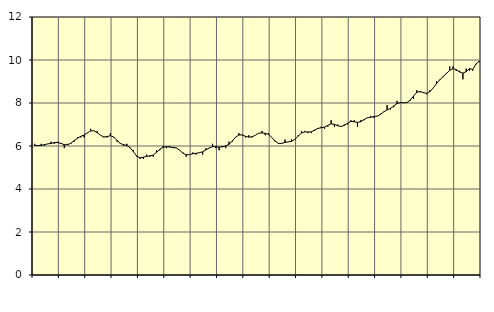
| Category | Piggar | Offentlig förvaltning m.m., SNI 84, 99 |
|---|---|---|
| nan | 6.1 | 6.03 |
| 87.0 | 6 | 6.02 |
| 87.0 | 6.1 | 6.03 |
| 87.0 | 6 | 6.06 |
| nan | 6.1 | 6.1 |
| 88.0 | 6.2 | 6.12 |
| 88.0 | 6.1 | 6.16 |
| 88.0 | 6.2 | 6.16 |
| nan | 6.1 | 6.12 |
| 89.0 | 5.9 | 6.06 |
| 89.0 | 6.1 | 6.06 |
| 89.0 | 6.1 | 6.13 |
| nan | 6.2 | 6.25 |
| 90.0 | 6.4 | 6.36 |
| 90.0 | 6.4 | 6.45 |
| 90.0 | 6.4 | 6.51 |
| nan | 6.6 | 6.61 |
| 91.0 | 6.8 | 6.7 |
| 91.0 | 6.7 | 6.71 |
| 91.0 | 6.7 | 6.62 |
| nan | 6.5 | 6.5 |
| 92.0 | 6.4 | 6.42 |
| 92.0 | 6.4 | 6.44 |
| 92.0 | 6.6 | 6.48 |
| nan | 6.4 | 6.42 |
| 93.0 | 6.2 | 6.26 |
| 93.0 | 6.1 | 6.12 |
| 93.0 | 6 | 6.06 |
| nan | 6.1 | 6.02 |
| 94.0 | 5.9 | 5.92 |
| 94.0 | 5.8 | 5.73 |
| 94.0 | 5.5 | 5.53 |
| nan | 5.4 | 5.45 |
| 95.0 | 5.4 | 5.48 |
| 95.0 | 5.6 | 5.52 |
| 95.0 | 5.5 | 5.54 |
| nan | 5.5 | 5.58 |
| 96.0 | 5.8 | 5.7 |
| 96.0 | 5.8 | 5.85 |
| 96.0 | 6 | 5.94 |
| nan | 5.9 | 5.97 |
| 97.0 | 6 | 5.95 |
| 97.0 | 5.9 | 5.93 |
| 97.0 | 5.9 | 5.91 |
| nan | 5.8 | 5.81 |
| 98.0 | 5.7 | 5.67 |
| 98.0 | 5.5 | 5.59 |
| 98.0 | 5.6 | 5.6 |
| nan | 5.7 | 5.64 |
| 99.0 | 5.6 | 5.66 |
| 99.0 | 5.7 | 5.69 |
| 99.0 | 5.6 | 5.73 |
| nan | 5.9 | 5.82 |
| 0.0 | 5.9 | 5.91 |
| 0.0 | 6.1 | 5.97 |
| 0.0 | 5.9 | 5.97 |
| nan | 5.8 | 5.95 |
| 1.0 | 6 | 5.96 |
| 1.0 | 5.9 | 6.01 |
| 1.0 | 6.2 | 6.08 |
| nan | 6.2 | 6.23 |
| 2.0 | 6.4 | 6.41 |
| 2.0 | 6.6 | 6.51 |
| 2.0 | 6.5 | 6.52 |
| nan | 6.4 | 6.45 |
| 3.0 | 6.5 | 6.41 |
| 3.0 | 6.4 | 6.43 |
| 3.0 | 6.5 | 6.5 |
| nan | 6.6 | 6.59 |
| 4.0 | 6.7 | 6.61 |
| 4.0 | 6.5 | 6.59 |
| 4.0 | 6.6 | 6.54 |
| nan | 6.4 | 6.4 |
| 5.0 | 6.2 | 6.23 |
| 5.0 | 6.1 | 6.12 |
| 5.0 | 6.1 | 6.12 |
| nan | 6.3 | 6.17 |
| 6.0 | 6.2 | 6.19 |
| 6.0 | 6.3 | 6.22 |
| 6.0 | 6.3 | 6.31 |
| nan | 6.5 | 6.46 |
| 7.0 | 6.7 | 6.6 |
| 7.0 | 6.7 | 6.66 |
| 7.0 | 6.6 | 6.65 |
| nan | 6.6 | 6.66 |
| 8.0 | 6.7 | 6.74 |
| 8.0 | 6.8 | 6.82 |
| 8.0 | 6.9 | 6.85 |
| nan | 6.8 | 6.88 |
| 9.0 | 6.9 | 6.96 |
| 9.0 | 7.2 | 7.03 |
| 9.0 | 6.9 | 7.01 |
| nan | 7 | 6.94 |
| 10.0 | 6.9 | 6.91 |
| 10.0 | 7 | 6.96 |
| 10.0 | 7 | 7.06 |
| nan | 7.2 | 7.14 |
| 11.0 | 7.2 | 7.13 |
| 11.0 | 6.9 | 7.1 |
| 11.0 | 7.2 | 7.13 |
| nan | 7.2 | 7.23 |
| 12.0 | 7.3 | 7.31 |
| 12.0 | 7.4 | 7.34 |
| 12.0 | 7.3 | 7.37 |
| nan | 7.4 | 7.39 |
| 13.0 | 7.5 | 7.47 |
| 13.0 | 7.6 | 7.59 |
| 13.0 | 7.9 | 7.68 |
| nan | 7.7 | 7.75 |
| 14.0 | 7.8 | 7.86 |
| 14.0 | 8.1 | 7.97 |
| 14.0 | 8 | 8.02 |
| nan | 8 | 8.01 |
| 15.0 | 8 | 8.02 |
| 15.0 | 8.1 | 8.13 |
| 15.0 | 8.2 | 8.32 |
| nan | 8.6 | 8.49 |
| 16.0 | 8.5 | 8.54 |
| 16.0 | 8.5 | 8.48 |
| 16.0 | 8.4 | 8.45 |
| nan | 8.6 | 8.53 |
| 17.0 | 8.7 | 8.7 |
| 17.0 | 9 | 8.9 |
| 17.0 | 9.1 | 9.08 |
| nan | 9.2 | 9.23 |
| 18.0 | 9.4 | 9.37 |
| 18.0 | 9.7 | 9.52 |
| 18.0 | 9.7 | 9.6 |
| nan | 9.5 | 9.55 |
| 19.0 | 9.5 | 9.44 |
| 19.0 | 9.1 | 9.39 |
| 19.0 | 9.6 | 9.46 |
| nan | 9.5 | 9.6 |
| 20.0 | 9.5 | 9.56 |
| 20.0 | 9.8 | 9.82 |
| 20.0 | 9.9 | 9.95 |